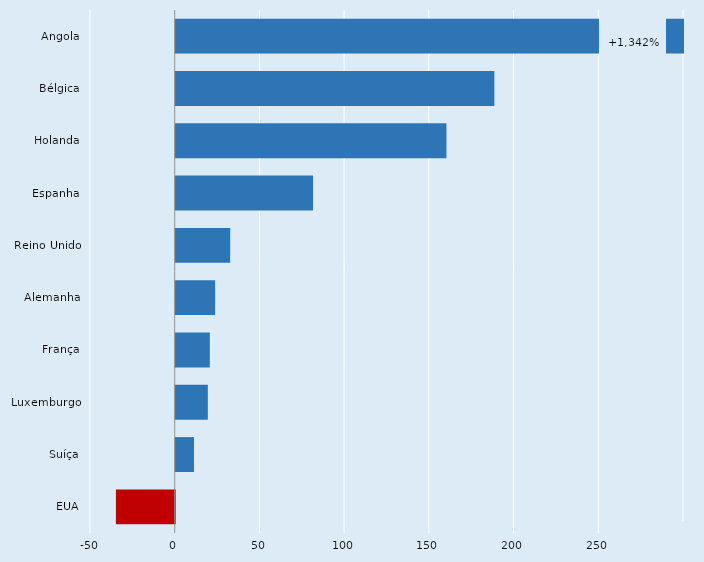
| Category | Series 0 |
|---|---|
| Angola | 300 |
| Bélgica | 188.061 |
| Holanda | 159.784 |
| Espanha | 81.065 |
| Reino Unido | 32.157 |
| Alemanha | 23.274 |
| França | 20.128 |
| Luxemburgo | 18.955 |
| Suíça | 10.801 |
| EUA | -34.711 |